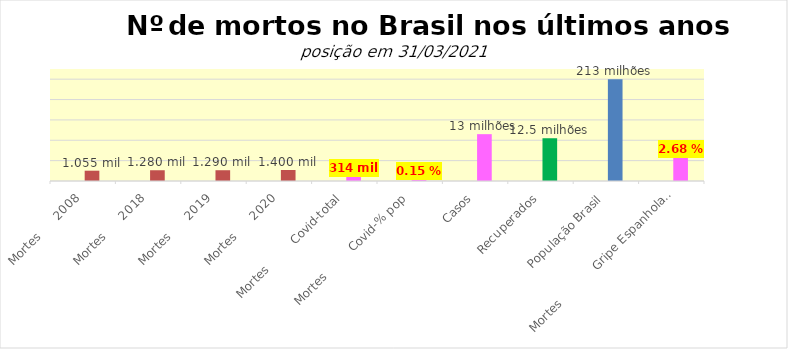
| Category | Series 0 | Series 1 |
|---|---|---|
| Mortes      2008 |  | 5055 |
| Mortes      2018 |  | 5280 |
| Mortes      2019 |  | 5290 |
| Mortes      2020 |  | 5400 |
| Mortes         Covid-total |  | 2314 |
| Mortes         Covid-% pop |  | 1150 |
|       Casos |  | 23000 |
| Recuperados |  | 21000 |
| População Brasil |  | 50000 |
| Mortes            Gripe Espanhola-%pop |  | 12000 |